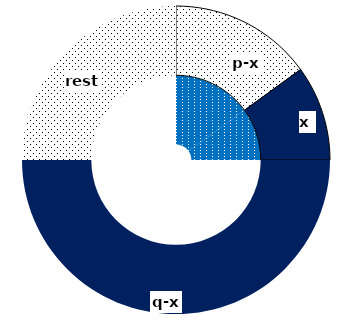
| Category | Series 0 | Series 1 |
|---|---|---|
| p-x | 0.15 | 0.15 |
| x | 0.1 | 0.1 |
| q-x | 0.5 | 0.5 |
| rest | 0.25 | 0.25 |